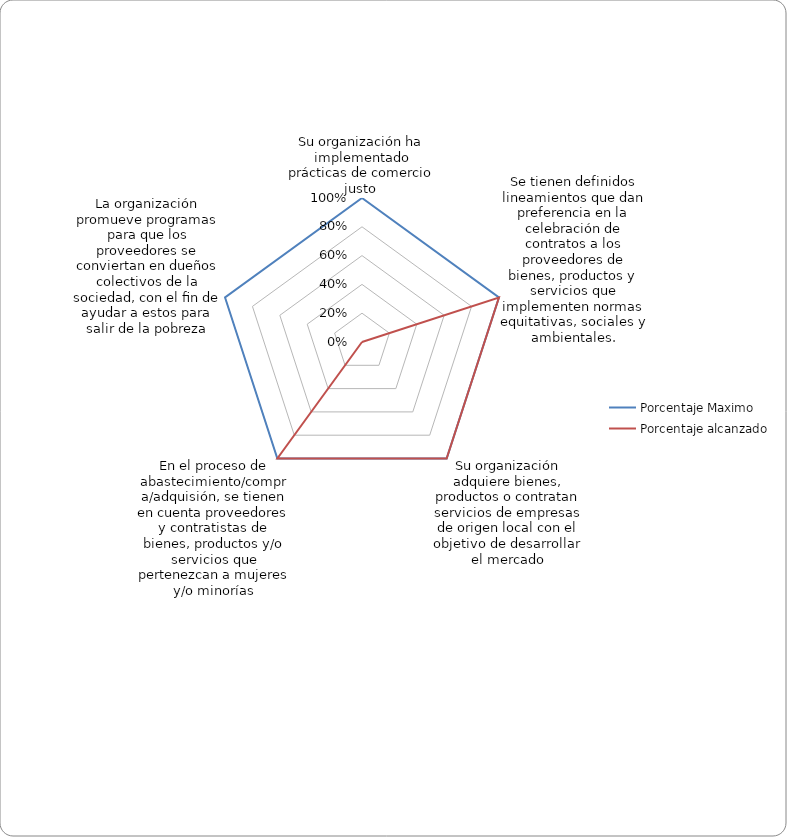
| Category | Porcentaje Maximo | Porcentaje alcanzado |
|---|---|---|
| Su organización ha implementado prácticas de comercio justo  | 1 | 0 |
| Se tienen definidos lineamientos que dan preferencia en la celebración de contratos a los proveedores de bienes, productos y servicios que implementen normas equitativas, sociales y ambientales. | 1 | 1 |
| Su organización adquiere bienes, productos o contratan servicios de empresas de origen local con el objetivo de desarrollar el mercado | 1 | 1 |
| En el proceso de abastecimiento/compra/adquisión, se tienen en cuenta proveedores y contratistas de bienes, productos y/o servicios que pertenezcan a mujeres y/o minorías | 1 | 1 |
| La organización promueve programas para que los proveedores se conviertan en dueños colectivos de la sociedad, con el ﬁn de ayudar a estos para salir de la pobreza | 1 | 0 |